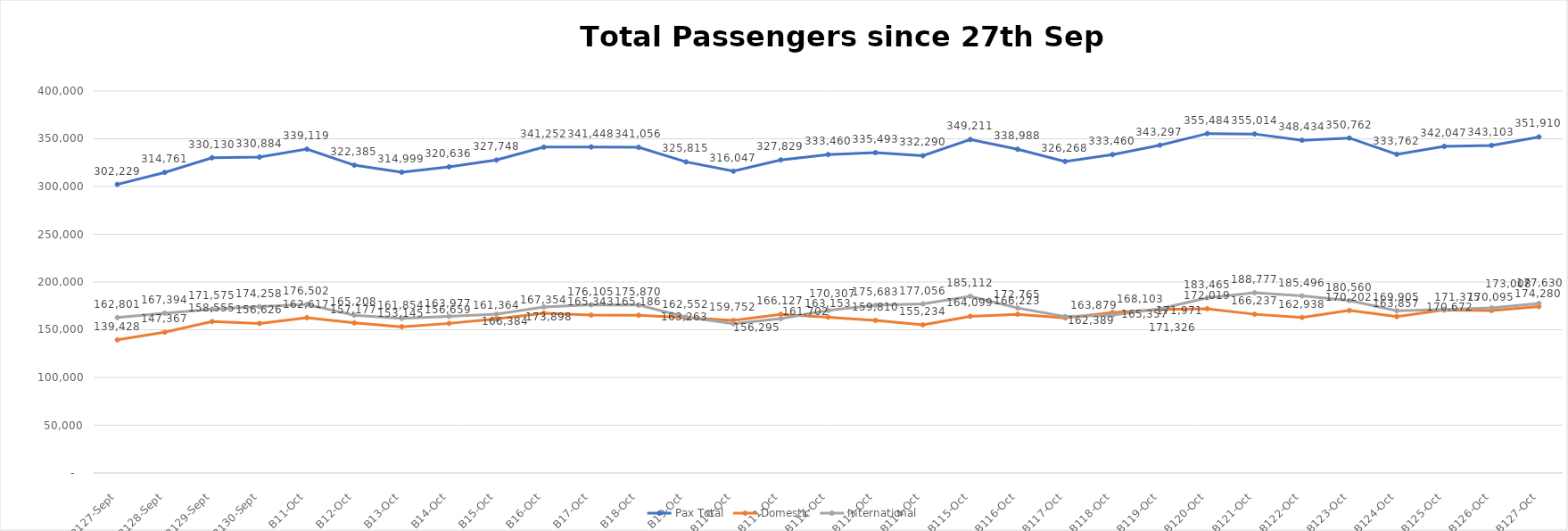
| Category | Pax Total | Domestic | International |
|---|---|---|---|
| 2023-09-27 | 302229 | 139428 | 162801 |
| 2023-09-28 | 314761 | 147367 | 167394 |
| 2023-09-29 | 330130 | 158555 | 171575 |
| 2023-09-30 | 330884 | 156626 | 174258 |
| 2023-10-01 | 339119 | 162617 | 176502 |
| 2023-10-02 | 322385 | 157177 | 165208 |
| 2023-10-03 | 314999 | 153145 | 161854 |
| 2023-10-04 | 320636 | 156659 | 163977 |
| 2023-10-05 | 327748 | 161364 | 166384 |
| 2023-10-06 | 341252 | 167354 | 173898 |
| 2023-10-07 | 341448 | 165343 | 176105 |
| 2023-10-08 | 341056 | 165186 | 175870 |
| 2023-10-09 | 325815 | 162552 | 163263 |
| 2023-10-10 | 316047 | 159752 | 156295 |
| 2023-10-11 | 327829 | 166127 | 161702 |
| 2023-10-12 | 333460 | 163153 | 170307 |
| 2023-10-13 | 335493 | 159810 | 175683 |
| 2023-10-14 | 332290 | 155234 | 177056 |
| 2023-10-15 | 349211 | 164099 | 185112 |
| 2023-10-16 | 338988 | 166223 | 172765 |
| 2023-10-17 | 326268 | 162389 | 163879 |
| 2023-10-18 | 333460 | 168103 | 165357 |
| 2023-10-19 | 343297 | 171326 | 171971 |
| 2023-10-20 | 355484 | 172019 | 183465 |
| 2023-10-21 | 355014 | 166237 | 188777 |
| 2023-10-22 | 348434 | 162938 | 185496 |
| 2023-10-23 | 350762 | 170202 | 180560 |
| 2023-10-24 | 333762 | 163857 | 169905 |
| 2023-10-25 | 342047 | 170672 | 171375 |
| 2023-10-26 | 343103 | 170095 | 173008 |
| 2023-10-27 | 351910 | 174280 | 177630 |